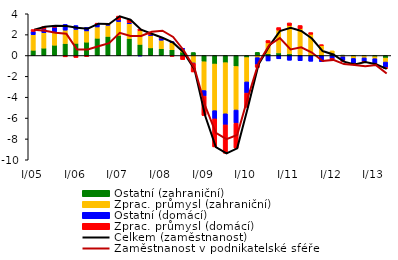
| Category | Ostatní (zahraniční) | Zprac. průmysl (zahraniční) | Ostatní (domácí) | Zprac. průmysl (domácí) |
|---|---|---|---|---|
| I/05 | 0.504 | 1.492 | 0.314 | 0.181 |
| II | 0.707 | 1.478 | 0.359 | 0.235 |
| III | 0.984 | 1.295 | 0.425 | 0.159 |
| IV | 1.149 | 1.281 | 0.552 | -0.13 |
| I/06 | 1.168 | 1.332 | 0.373 | -0.192 |
| II | 1.281 | 1.076 | 0.336 | -0.1 |
| III | 1.653 | 1.083 | 0.318 | 0.021 |
| IV | 1.832 | 1.078 | 0.034 | 0.102 |
| I/07 | 1.927 | 1.329 | 0.157 | 0.368 |
| II | 1.63 | 1.408 | 0.101 | 0.309 |
| III | 1.068 | 1.298 | -0.044 | 0.172 |
| IV | 0.73 | 1.181 | 0.071 | 0.129 |
| I/08 | 0.656 | 0.811 | 0.209 | 0.046 |
| II | 0.562 | 0.658 | 0.116 | -0.084 |
| III | 0.325 | 0.264 | 0.104 | -0.393 |
| IV | 0.287 | -0.743 | -0.022 | -0.813 |
| I/09 | -0.597 | -2.764 | -0.532 | -1.865 |
| II | -0.818 | -4.47 | -0.787 | -2.691 |
| III | -0.686 | -4.901 | -1.065 | -2.722 |
| IV | -1.053 | -4.174 | -1.261 | -2.395 |
| I/10 | -0.196 | -2.335 | -1.074 | -1.364 |
| II | 0.3 | -0.203 | -0.665 | -0.276 |
| III | 0.174 | 1.033 | -0.523 | 0.233 |
| IV | 0.247 | 2.181 | -0.318 | 0.251 |
| I/11 | 0.159 | 2.712 | -0.456 | 0.254 |
| II | 0.062 | 2.511 | -0.5 | 0.304 |
| III | -0.065 | 2.035 | -0.489 | 0.165 |
| IV | -0.024 | 0.962 | -0.564 | 0.072 |
| I/12 | 0.204 | 0.244 | -0.319 | -0.008 |
| II | -0.012 | -0.106 | -0.368 | -0.082 |
| III | -0.084 | -0.198 | -0.47 | -0.091 |
| IV | -0.045 | -0.184 | -0.362 | -0.024 |
| I/13 | -0.112 | -0.193 | -0.438 | -0.08 |
| II | -0.245 | -0.383 | -0.522 | -0.116 |